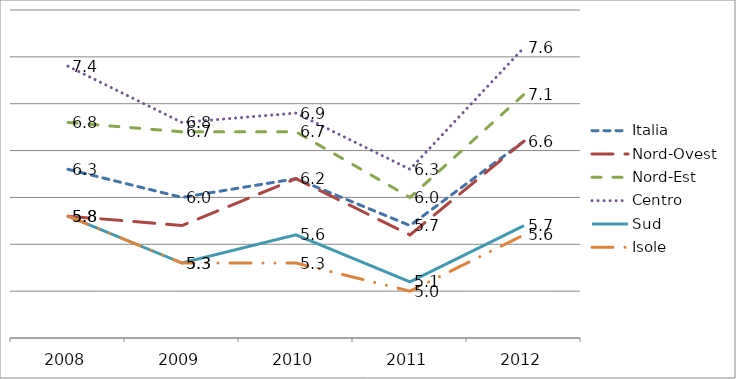
| Category | Italia | Nord-Ovest | Nord-Est | Centro  | Sud | Isole |
|---|---|---|---|---|---|---|
| 2008.0 | 6.3 | 5.8 | 6.8 | 7.4 | 5.8 | 5.8 |
| 2009.0 | 6 | 5.7 | 6.7 | 6.8 | 5.3 | 5.3 |
| 2010.0 | 6.2 | 6.2 | 6.7 | 6.9 | 5.6 | 5.3 |
| 2011.0 | 5.7 | 5.6 | 6 | 6.3 | 5.1 | 5 |
| 2012.0 | 6.6 | 6.6 | 7.1 | 7.6 | 5.7 | 5.6 |